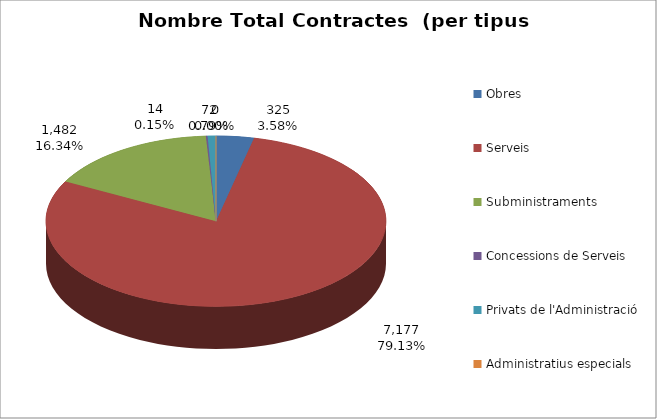
| Category | Nombre Total Contractes |
|---|---|
| Obres | 325 |
| Serveis | 7177 |
| Subministraments | 1482 |
| Concessions de Serveis | 14 |
| Privats de l'Administració | 72 |
| Administratius especials | 0 |